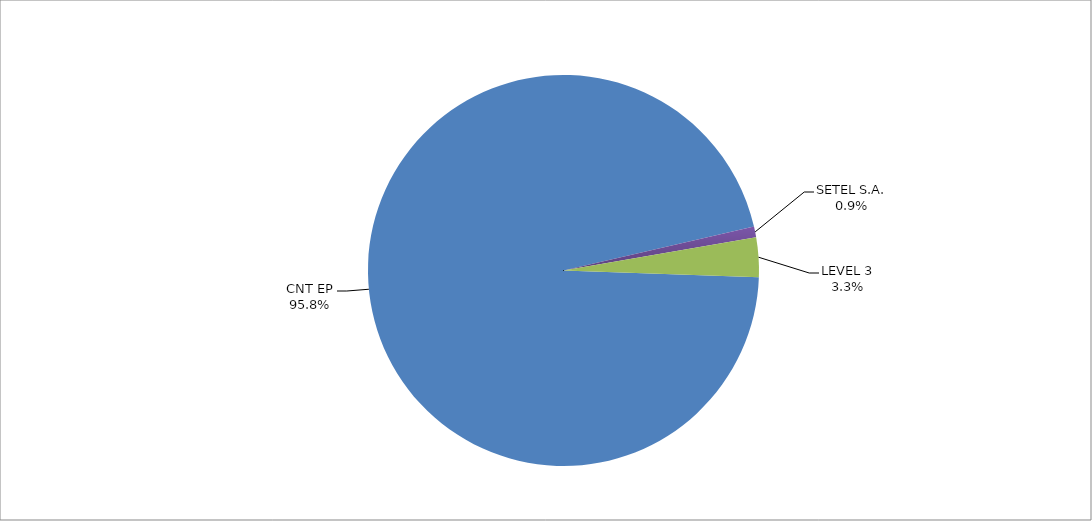
| Category | Series 0 |
|---|---|
| CNT EP | 322 |
| SETEL S.A. | 3 |
| LEVEL 3 | 11 |